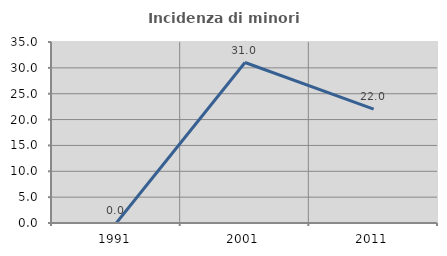
| Category | Incidenza di minori stranieri |
|---|---|
| 1991.0 | 0 |
| 2001.0 | 31.034 |
| 2011.0 | 22.034 |